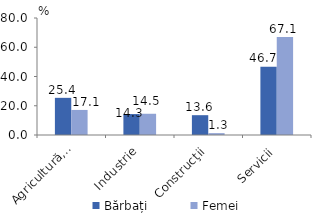
| Category | Bărbați | Femei |
|---|---|---|
| Agricultură, silvicultură şi pescuit | 25.409 | 17.136 |
| Industrie | 14.325 | 14.522 |
| Construcţii | 13.551 | 1.276 |
| Servicii | 46.715 | 67.065 |